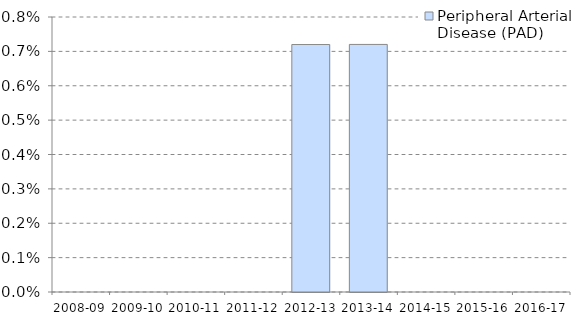
| Category | Peripheral Arterial Disease (PAD) |
|---|---|
| 2008-09 | 0 |
| 2009-10 | 0 |
| 2010-11 | 0 |
| 2011-12 | 0 |
| 2012-13 | 0.007 |
| 2013-14 | 0.007 |
| 2014-15 | 0 |
| 2015-16 | 0 |
| 2016-17 | 0 |